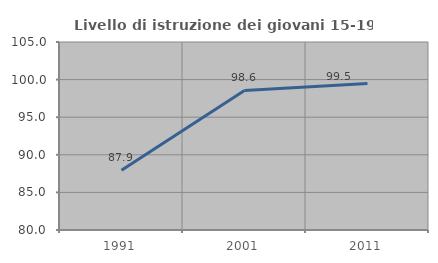
| Category | Livello di istruzione dei giovani 15-19 anni |
|---|---|
| 1991.0 | 87.931 |
| 2001.0 | 98.565 |
| 2011.0 | 99.468 |